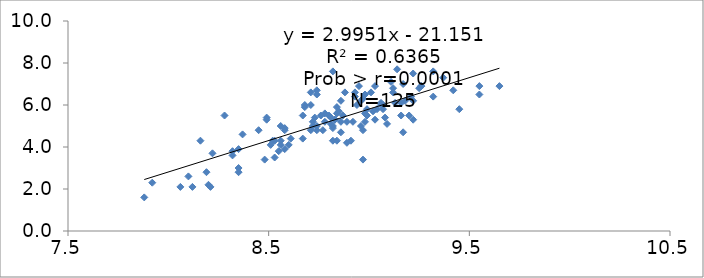
| Category | Series 0 |
|---|---|
| 7.88 | 1.6 |
| 7.92 | 2.3 |
| 8.06 | 2.1 |
| 8.1 | 2.6 |
| 8.12 | 2.1 |
| 8.16 | 4.3 |
| 8.19 | 2.8 |
| 8.2 | 2.2 |
| 8.21 | 2.1 |
| 8.22 | 3.7 |
| 8.28 | 5.5 |
| 8.32 | 3.8 |
| 8.32 | 3.6 |
| 8.35 | 2.8 |
| 8.35 | 3 |
| 8.35 | 3.9 |
| 8.37 | 4.6 |
| 8.45 | 4.8 |
| 8.48 | 3.4 |
| 8.49 | 5.4 |
| 8.49 | 5.3 |
| 8.51 | 4.1 |
| 8.52 | 4.3 |
| 8.53 | 4.3 |
| 8.53 | 3.5 |
| 8.55 | 3.8 |
| 8.56 | 4.1 |
| 8.56 | 5 |
| 8.56 | 4.3 |
| 8.58 | 3.9 |
| 8.58 | 4.8 |
| 8.58 | 4.9 |
| 8.6 | 4.1 |
| 8.61 | 4.4 |
| 8.67 | 4.4 |
| 8.67 | 5.5 |
| 8.68 | 6 |
| 8.68 | 5.9 |
| 8.71 | 6 |
| 8.71 | 6.6 |
| 8.71 | 4.8 |
| 8.72 | 5.2 |
| 8.72 | 5 |
| 8.73 | 5.4 |
| 8.74 | 4.8 |
| 8.74 | 6.7 |
| 8.74 | 6.5 |
| 8.74 | 5 |
| 8.76 | 5.5 |
| 8.77 | 4.8 |
| 8.78 | 5.2 |
| 8.78 | 5.6 |
| 8.8 | 5.5 |
| 8.81 | 5.4 |
| 8.81 | 5.1 |
| 8.82 | 5 |
| 8.82 | 4.9 |
| 8.82 | 7.6 |
| 8.82 | 4.3 |
| 8.83 | 5.3 |
| 8.83 | 5.3 |
| 8.84 | 4.3 |
| 8.84 | 5.6 |
| 8.84 | 5.9 |
| 8.85 | 5.7 |
| 8.86 | 4.7 |
| 8.86 | 5.2 |
| 8.86 | 6.2 |
| 8.870000000000001 | 5.5 |
| 8.88 | 6.6 |
| 8.89 | 4.2 |
| 8.89 | 5.2 |
| 8.91 | 4.3 |
| 8.92 | 5.2 |
| 8.93 | 6.6 |
| 8.93 | 6.4 |
| 8.94 | 6 |
| 8.95 | 6.9 |
| 8.96 | 5 |
| 8.96 | 6.2 |
| 8.97 | 3.4 |
| 8.97 | 6.3 |
| 8.97 | 4.8 |
| 8.98 | 5.2 |
| 8.98 | 5.6 |
| 8.98 | 6.5 |
| 8.99 | 5.8 |
| 8.99 | 5.5 |
| 9.01 | 6.6 |
| 9.02 | 5.7 |
| 9.03 | 5.3 |
| 9.03 | 6.9 |
| 9.04 | 5.8 |
| 9.06 | 6 |
| 9.06 | 6.1 |
| 9.07 | 6 |
| 9.07 | 5.8 |
| 9.08 | 5.4 |
| 9.09 | 5.1 |
| 9.11 | 7.1 |
| 9.12 | 6.6 |
| 9.12 | 6.8 |
| 9.13 | 6.1 |
| 9.14 | 7.7 |
| 9.16 | 5.5 |
| 9.16 | 6.1 |
| 9.17 | 4.7 |
| 9.17 | 7 |
| 9.18 | 6.2 |
| 9.2 | 5.5 |
| 9.21 | 6.4 |
| 9.22 | 5.3 |
| 9.22 | 6.2 |
| 9.22 | 7.5 |
| 9.25 | 6.8 |
| 9.26 | 6.9 |
| 9.26 | 6.9 |
| 9.32 | 6.4 |
| 9.32 | 7.6 |
| 9.37 | 7.3 |
| 9.42 | 6.7 |
| 9.45 | 5.8 |
| 9.55 | 6.9 |
| 9.55 | 6.5 |
| 9.65 | 6.9 |